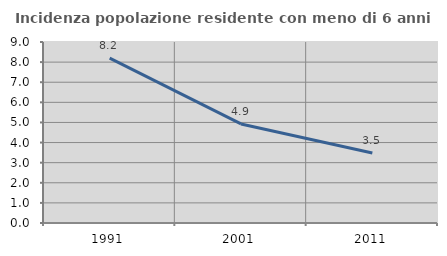
| Category | Incidenza popolazione residente con meno di 6 anni |
|---|---|
| 1991.0 | 8.196 |
| 2001.0 | 4.926 |
| 2011.0 | 3.482 |